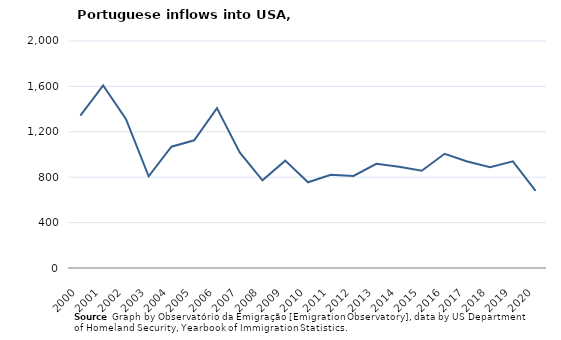
| Category | Entradas de portugueses |
|---|---|
| 2000.0 | 1343 |
| 2001.0 | 1609 |
| 2002.0 | 1313 |
| 2003.0 | 808 |
| 2004.0 | 1069 |
| 2005.0 | 1125 |
| 2006.0 | 1409 |
| 2007.0 | 1019 |
| 2008.0 | 772 |
| 2009.0 | 946 |
| 2010.0 | 755 |
| 2011.0 | 821 |
| 2012.0 | 811 |
| 2013.0 | 918 |
| 2014.0 | 892 |
| 2015.0 | 857 |
| 2016.0 | 1006 |
| 2017.0 | 939 |
| 2018.0 | 889 |
| 2019.0 | 940 |
| 2020.0 | 679 |